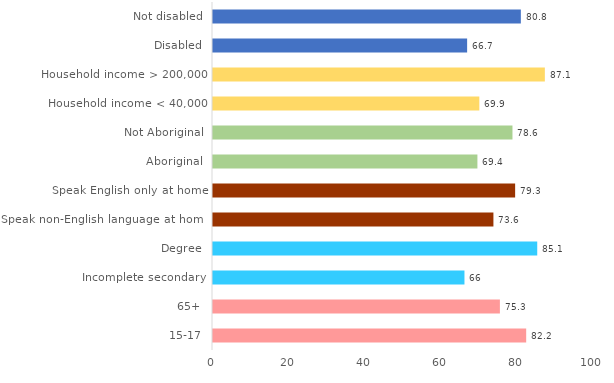
| Category | Series 0 |
|---|---|
| 15-17 | 82.2 |
| 65+ | 75.3 |
| Incomplete secondary | 66 |
| Degree | 85.1 |
| Speak non-English language at home | 73.6 |
| Speak English only at home | 79.3 |
| Aboriginal | 69.4 |
| Not Aboriginal | 78.6 |
| Household income < 40,000 | 69.9 |
| Household income > 200,000 | 87.1 |
| Disabled | 66.7 |
| Not disabled | 80.8 |